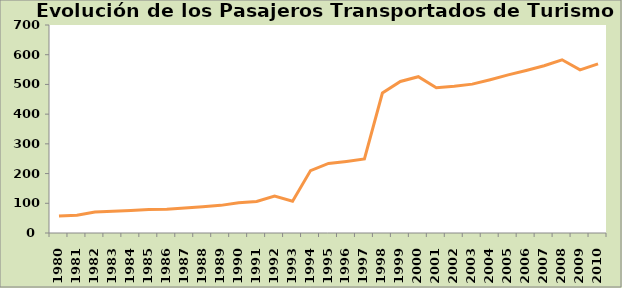
| Category | Series 0 |
|---|---|
| 1980.0 | 57 |
| 1981.0 | 60 |
| 1982.0 | 71 |
| 1983.0 | 73 |
| 1984.0 | 76 |
| 1985.0 | 79 |
| 1986.0 | 80 |
| 1987.0 | 84 |
| 1988.0 | 88 |
| 1989.0 | 93 |
| 1990.0 | 102 |
| 1991.0 | 106 |
| 1992.0 | 124 |
| 1993.0 | 107 |
| 1994.0 | 210 |
| 1995.0 | 234 |
| 1996.0 | 241 |
| 1997.0 | 249 |
| 1998.0 | 471 |
| 1999.0 | 510 |
| 2000.0 | 526 |
| 2001.0 | 489 |
| 2002.0 | 494 |
| 2003.0 | 501 |
| 2004.0 | 516 |
| 2005.0 | 532 |
| 2006.0 | 547 |
| 2007.0 | 563 |
| 2008.0 | 583 |
| 2009.0 | 549 |
| 2010.0 | 569 |